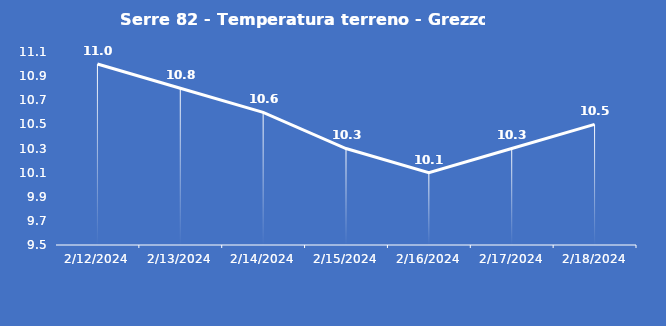
| Category | Serre 82 - Temperatura terreno - Grezzo (°C) |
|---|---|
| 2/12/24 | 11 |
| 2/13/24 | 10.8 |
| 2/14/24 | 10.6 |
| 2/15/24 | 10.3 |
| 2/16/24 | 10.1 |
| 2/17/24 | 10.3 |
| 2/18/24 | 10.5 |